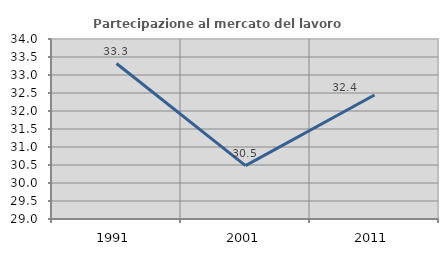
| Category | Partecipazione al mercato del lavoro  femminile |
|---|---|
| 1991.0 | 33.319 |
| 2001.0 | 30.481 |
| 2011.0 | 32.446 |